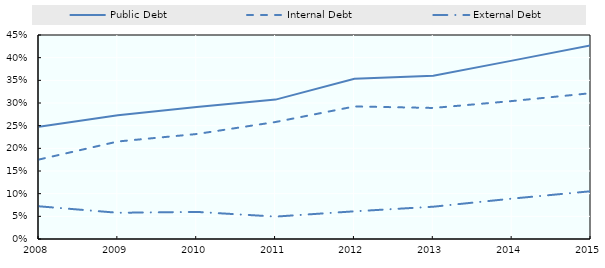
| Category | Public Debt | Internal Debt | External Debt |
|---|---|---|---|
| 2008.0 | 0.247 | 0.175 | 0.072 |
| 2009.0 | 0.273 | 0.215 | 0.058 |
| 2010.0 | 0.291 | 0.232 | 0.06 |
| 2011.0 | 0.307 | 0.258 | 0.049 |
| 2012.0 | 0.353 | 0.292 | 0.061 |
| 2013.0 | 0.36 | 0.289 | 0.071 |
| 2014.0 | 0.393 | 0.304 | 0.089 |
| 2015.0 | 0.427 | 0.322 | 0.105 |